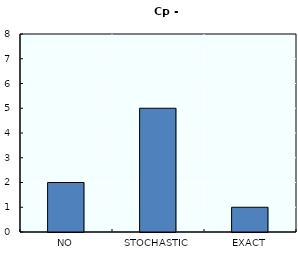
| Category | Series 0 |
|---|---|
| NO | 2 |
| STOCHASTIC | 5 |
| EXACT | 1 |